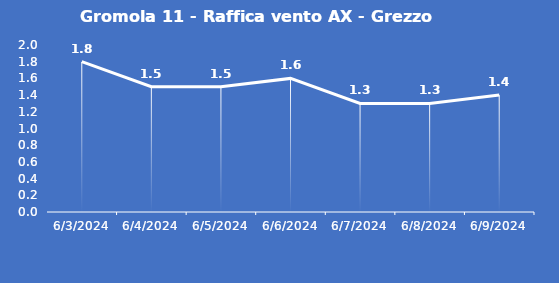
| Category | Gromola 11 - Raffica vento AX - Grezzo (m/s) |
|---|---|
| 6/3/24 | 1.8 |
| 6/4/24 | 1.5 |
| 6/5/24 | 1.5 |
| 6/6/24 | 1.6 |
| 6/7/24 | 1.3 |
| 6/8/24 | 1.3 |
| 6/9/24 | 1.4 |